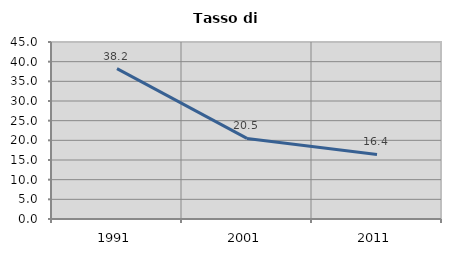
| Category | Tasso di disoccupazione   |
|---|---|
| 1991.0 | 38.214 |
| 2001.0 | 20.491 |
| 2011.0 | 16.421 |